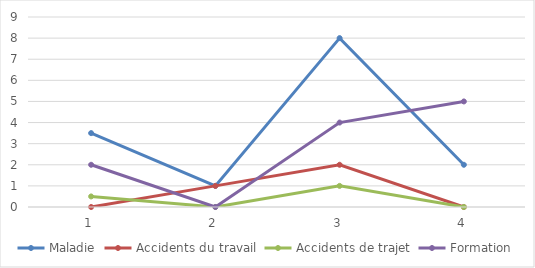
| Category | Maladie | Accidents du travail | Accidents de trajet | Formation |
|---|---|---|---|---|
| 0 | 3.5 | 0 | 0.5 | 2 |
| 1 | 1 | 1 | 0 | 0 |
| 2 | 8 | 2 | 1 | 4 |
| 3 | 2 | 0 | 0 | 5 |